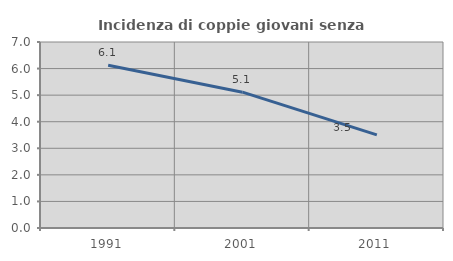
| Category | Incidenza di coppie giovani senza figli |
|---|---|
| 1991.0 | 6.122 |
| 2001.0 | 5.112 |
| 2011.0 | 3.503 |